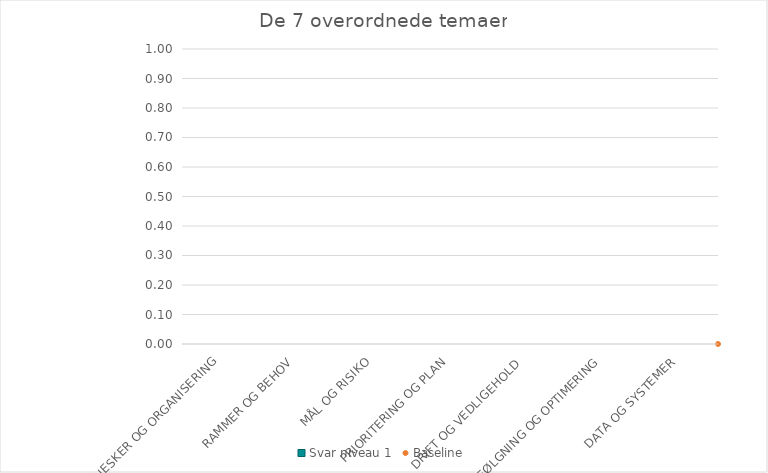
| Category | Svar niveau 1 |
|---|---|
| MENNESKER OG ORGANISERING | 0 |
| RAMMER OG BEHOV | 0 |
| MÅL OG RISIKO | 0 |
| PRIORITERING OG PLAN | 0 |
| DRIFT OG VEDLIGEHOLD  | 0 |
| OPFØLGNING OG OPTIMERING | 0 |
| DATA OG SYSTEMER | 0 |